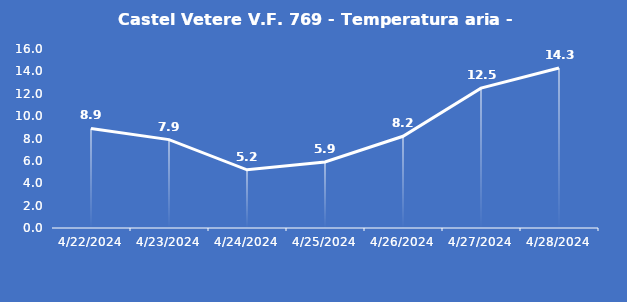
| Category | Castel Vetere V.F. 769 - Temperatura aria - Grezzo (°C) |
|---|---|
| 4/22/24 | 8.9 |
| 4/23/24 | 7.9 |
| 4/24/24 | 5.2 |
| 4/25/24 | 5.9 |
| 4/26/24 | 8.2 |
| 4/27/24 | 12.5 |
| 4/28/24 | 14.3 |